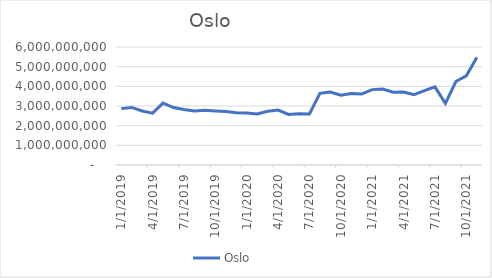
| Category | Oslo |
|---|---|
| 1/1/19 | 2866922916.667 |
| 2/1/19 | 2927768750 |
| 3/1/19 | 2746285416.667 |
| 4/1/19 | 2638960416.667 |
| 5/1/19 | 3149697916.667 |
| 6/1/19 | 2922608333.333 |
| 7/1/19 | 2820005833.333 |
| 8/1/19 | 2748947500 |
| 9/1/19 | 2780251666.667 |
| 10/1/19 | 2747197500 |
| 11/1/19 | 2714318333.333 |
| 12/1/19 | 2655314166.667 |
| 1/1/20 | 2640085000 |
| 2/1/20 | 2593351666.667 |
| 3/1/20 | 2730110000 |
| 4/1/20 | 2794272500 |
| 5/1/20 | 2568989166.667 |
| 6/1/20 | 2606051666.667 |
| 7/1/20 | 2593533333.333 |
| 8/1/20 | 3646852500 |
| 9/1/20 | 3706081666.667 |
| 10/1/20 | 3549352500 |
| 11/1/20 | 3638356666.667 |
| 12/1/20 | 3613685833.333 |
| 1/1/21 | 3833319166.667 |
| 2/1/21 | 3866165000 |
| 3/1/21 | 3704665000 |
| 4/1/21 | 3714685833.333 |
| 5/1/21 | 3573844166.667 |
| 6/1/21 | 3777897500 |
| 7/1/21 | 3973568333.333 |
| 8/1/21 | 3135365833.333 |
| 9/1/21 | 4244765833.333 |
| 10/1/21 | 4536495000 |
| 11/1/21 | 5464490833.333 |